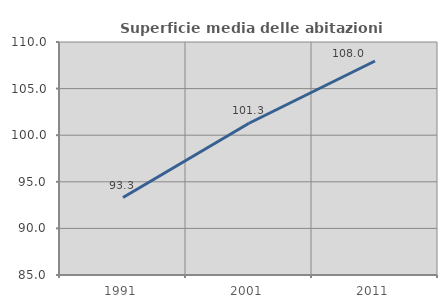
| Category | Superficie media delle abitazioni occupate |
|---|---|
| 1991.0 | 93.312 |
| 2001.0 | 101.284 |
| 2011.0 | 107.958 |